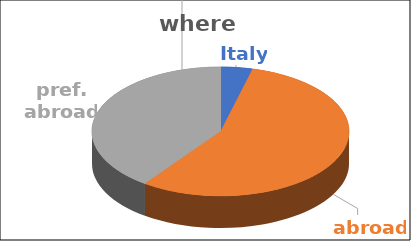
| Category | where | Series 1 | Series 2 | Series 3 | Series 4 |
|---|---|---|---|---|---|
| Italy | 0.04 |  |  |  |  |
| abroad | 0.56 |  |  |  |  |
| pref. abroad | 0.4 |  |  |  |  |